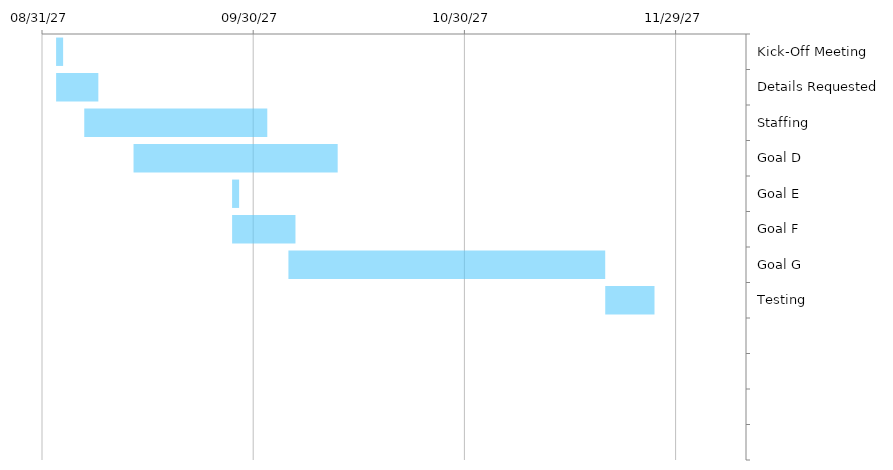
| Category | START DATE | DURATION IN DAYS |
|---|---|---|
| Kick-Off Meeting | 2027-09-02 | 1 |
| Details Requested | 2027-09-02 | 6 |
| Staffing | 2027-09-06 | 26 |
| Goal D | 2027-09-13 | 29 |
| Goal E | 2027-09-27 | 1 |
| Goal F | 2027-09-27 | 9 |
| Goal G | 2027-10-05 | 45 |
| Testing | 2027-11-19 | 7 |